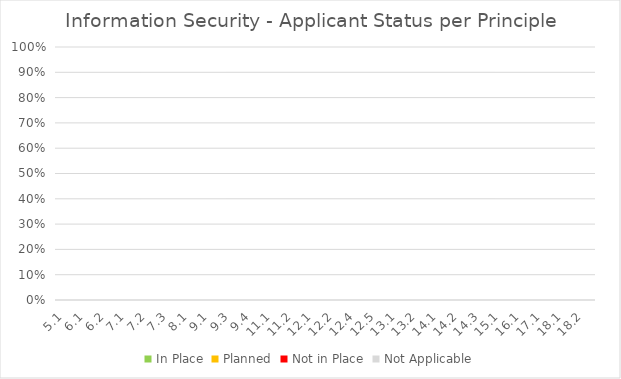
| Category | In Place | Planned | Not in Place | Not Applicable |
|---|---|---|---|---|
| 5.1 | 0 | 0 | 0 | 0 |
| 6.1 | 0 | 0 | 0 | 0 |
| 6.2 | 0 | 0 | 0 | 0 |
| 7.1 | 0 | 0 | 0 | 0 |
| 7.2 | 0 | 0 | 0 | 0 |
| 7.3 | 0 | 0 | 0 | 0 |
| 8.1 | 0 | 0 | 0 | 0 |
| 9.1 | 0 | 0 | 0 | 0 |
| 9.3 | 0 | 0 | 0 | 0 |
| 9.4 | 0 | 0 | 0 | 0 |
| 11.1 | 0 | 0 | 0 | 0 |
| 11.2 | 0 | 0 | 0 | 0 |
| 12.1 | 0 | 0 | 0 | 0 |
| 12.2 | 0 | 0 | 0 | 0 |
| 12.4 | 0 | 0 | 0 | 0 |
| 12.5 | 0 | 0 | 0 | 0 |
| 13.1 | 0 | 0 | 0 | 0 |
| 13.2 | 0 | 0 | 0 | 0 |
| 14.1 | 0 | 0 | 0 | 0 |
| 14.2 | 0 | 0 | 0 | 0 |
| 14.3 | 0 | 0 | 0 | 0 |
| 15.1 | 0 | 0 | 0 | 0 |
| 16.1 | 0 | 0 | 0 | 0 |
| 17.1 | 0 | 0 | 0 | 0 |
| 18.1 | 0 | 0 | 0 | 0 |
| 18.2 | 0 | 0 | 0 | 0 |